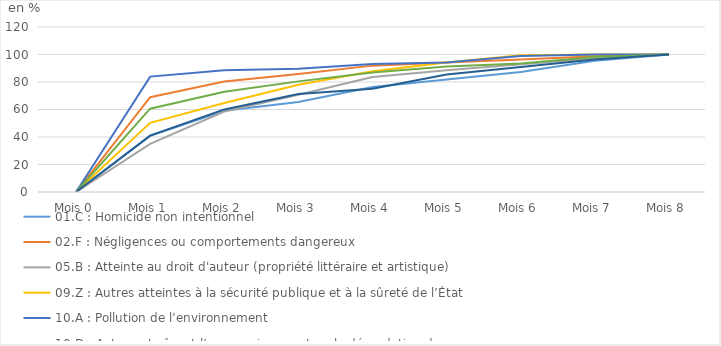
| Category | 01.C : Homicide non intentionnel  | 02.F : Négligences ou comportements dangereux | 05.B : Atteinte au droit d'auteur (propriété littéraire et artistique)  | 09.Z : Autres atteintes à la sécurité publique et à la sûreté de l’État  | 10.A : Pollution de l’environnement | 10.D : Actes entraînant l’appauvrissement ou la dégradation des ressources naturelles | 10.Z : Autres atteintes au milieu naturel |
|---|---|---|---|---|---|---|---|
| Mois 0 | 0 | 0 | 0 | 0 | 0 | 0 | 0 |
| Mois 1 | 40.909 | 68.931 | 35 | 50.289 | 83.908 | 60.586 | 40.973 |
| Mois 2 | 59.091 | 80.413 | 58.571 | 64.74 | 88.506 | 72.964 | 60.051 |
| Mois 3 | 65.455 | 85.812 | 70.714 | 78.035 | 89.655 | 80.456 | 71.319 |
| Mois 4 | 76.364 | 91.906 | 83.571 | 87.861 | 93.103 | 86.971 | 75.032 |
| Mois 5 | 81.818 | 94.191 | 88.571 | 94.22 | 94.253 | 91.205 | 85.531 |
| Mois 6 | 87.273 | 96.427 | 92.857 | 99.422 | 98.851 | 93.485 | 90.909 |
| Mois 7 | 95.455 | 98.779 | 97.143 | 100 | 100 | 98.208 | 96.287 |
| Mois 8 | 100 | 100 | 100 | 100 | 100 | 100 | 100 |